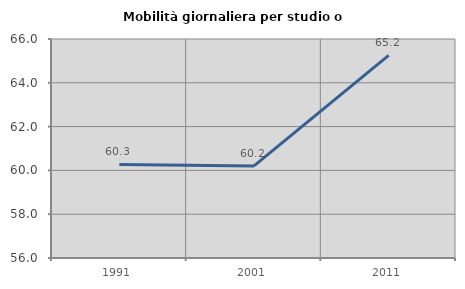
| Category | Mobilità giornaliera per studio o lavoro |
|---|---|
| 1991.0 | 60.27 |
| 2001.0 | 60.206 |
| 2011.0 | 65.25 |